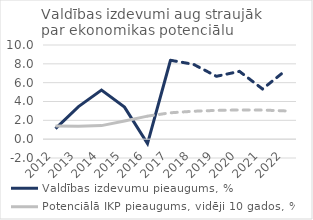
| Category | Valdības izdevumu pieaugums, % | Potenciālā IKP pieaugums, vidēji 10 gados, % |
|---|---|---|
| 2012 | 1.127 | 1.41 |
| 2013 | 3.456 | 1.359 |
| 2014 | 5.221 | 1.439 |
| 2015 | 3.403 | 1.938 |
| 2016 | -0.463 | 2.446 |
| 2017 | 8.379 | 2.802 |
| 2018 | 7.948 | 2.966 |
| 2019 | 6.676 | 3.055 |
| 2020 | 7.198 | 3.1 |
| 2021 | 5.329 | 3.091 |
| 2022 | 7.287 | 3 |